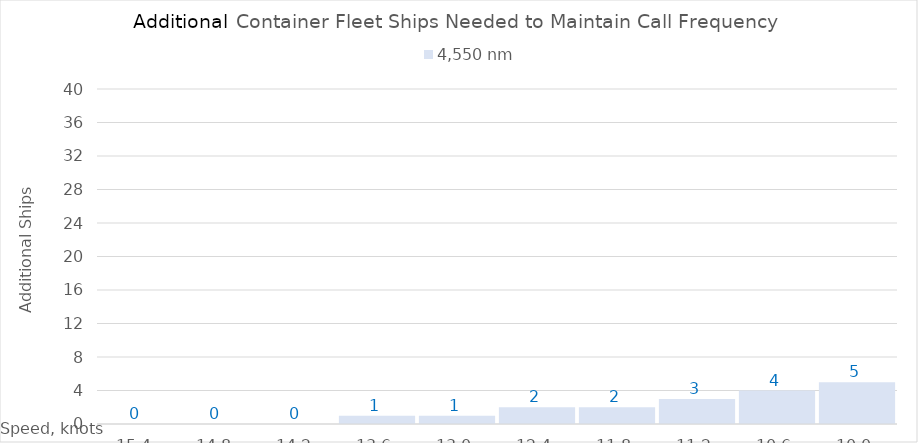
| Category | 4,550 |
|---|---|
| 15.4 | 0 |
| 14.8 | 0 |
| 14.200000000000001 | 0 |
| 13.600000000000001 | 1 |
| 13.000000000000002 | 1 |
| 12.400000000000002 | 2 |
| 11.800000000000002 | 2 |
| 11.200000000000003 | 3 |
| 10.600000000000003 | 4 |
| 10.000000000000004 | 5 |